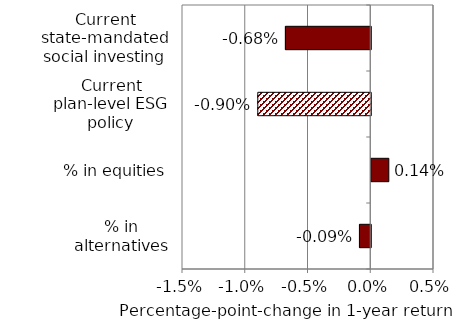
| Category | Series 0 |
|---|---|
| % in alternatives | -0.001 |
| % in equities | 0.001 |
| Current plan-level ESG policy | -0.009 |
| Current state-mandated social investing | -0.007 |